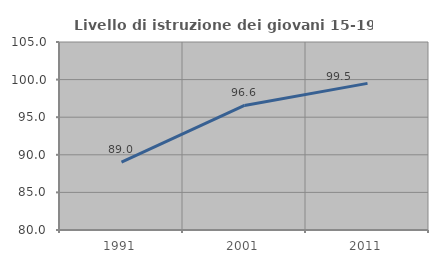
| Category | Livello di istruzione dei giovani 15-19 anni |
|---|---|
| 1991.0 | 89.037 |
| 2001.0 | 96.565 |
| 2011.0 | 99.497 |